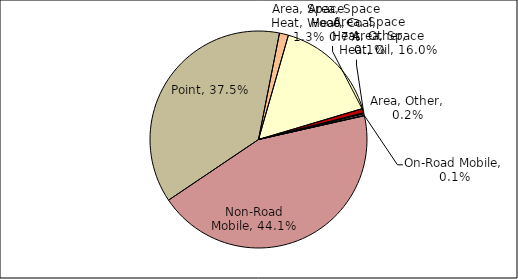
| Category | Series 0 |
|---|---|
| Point | 0.375 |
| Area, Space Heat, Wood | 0.013 |
| Area, Space Heat, Oil | 0.16 |
| Area, Space Heat, Coal | 0.007 |
| Area, Space Heat, Other | 0.001 |
| Area, Other | 0.002 |
| On-Road Mobile | 0.001 |
| Non-Road Mobile | 0.441 |